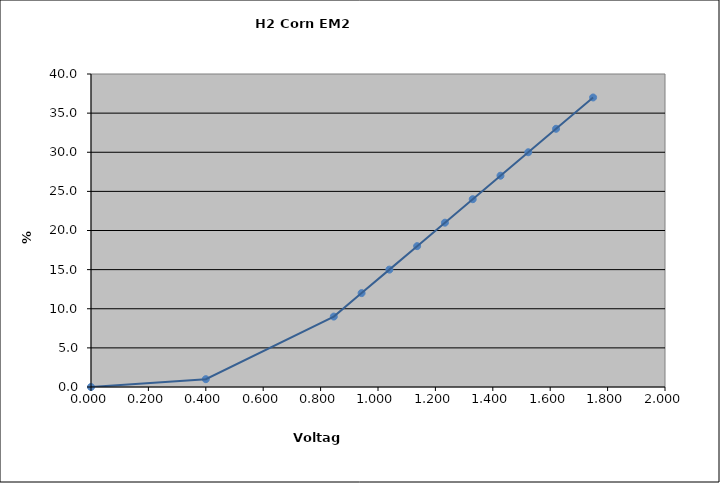
| Category | Generated Curve |
|---|---|
| 0.0 | 0 |
| 0.4 | 1 |
| 0.846 | 9 |
| 0.9428 | 12 |
| 1.0395999999999999 | 15 |
| 1.1363999999999999 | 18 |
| 1.2331999999999999 | 21 |
| 1.3299999999999998 | 24 |
| 1.4267999999999998 | 27 |
| 1.5235999999999998 | 30 |
| 1.6204 | 33 |
| 1.7494666666666667 | 37 |